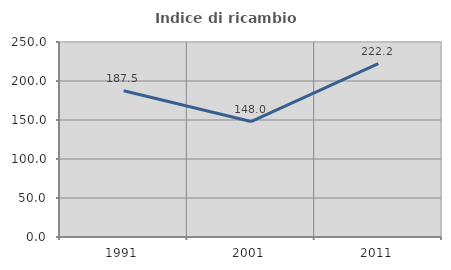
| Category | Indice di ricambio occupazionale  |
|---|---|
| 1991.0 | 187.5 |
| 2001.0 | 148 |
| 2011.0 | 222.222 |